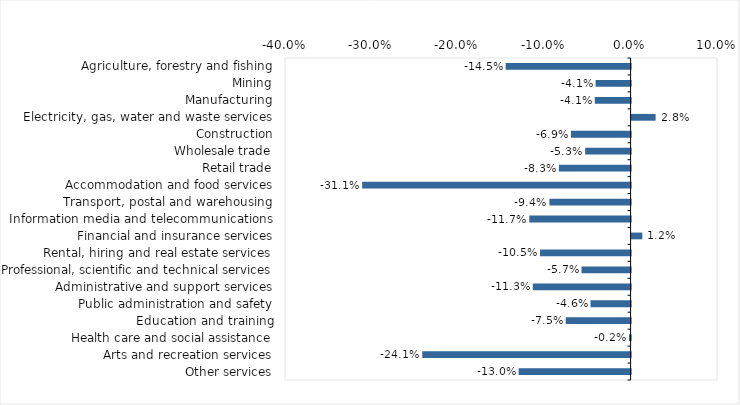
| Category | This week |
|---|---|
| Agriculture, forestry and fishing | -0.145 |
| Mining | -0.04 |
| Manufacturing | -0.041 |
| Electricity, gas, water and waste services | 0.028 |
| Construction | -0.069 |
| Wholesale trade | -0.053 |
| Retail trade | -0.083 |
| Accommodation and food services | -0.311 |
| Transport, postal and warehousing | -0.094 |
| Information media and telecommunications | -0.117 |
| Financial and insurance services | 0.012 |
| Rental, hiring and real estate services | -0.105 |
| Professional, scientific and technical services | -0.057 |
| Administrative and support services | -0.113 |
| Public administration and safety | -0.046 |
| Education and training | -0.075 |
| Health care and social assistance | -0.002 |
| Arts and recreation services | -0.241 |
| Other services | -0.13 |